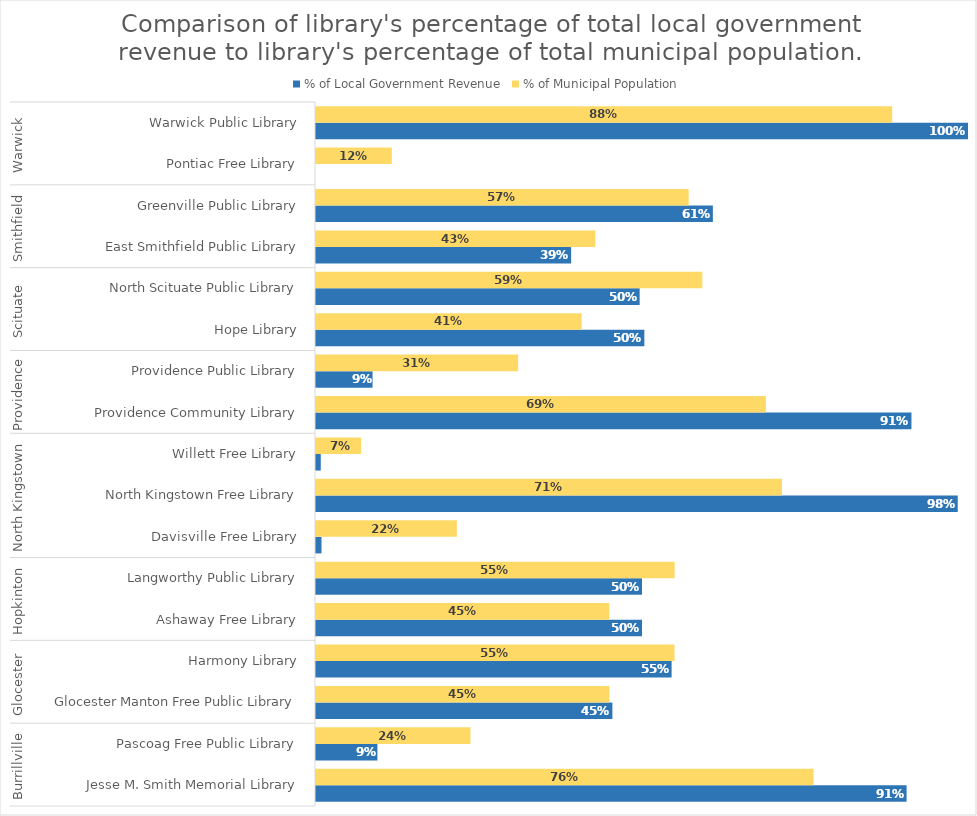
| Category | % of Local Government Revenue | % of Municipal Population |
|---|---|---|
| 0 | 0.906 | 0.763 |
| 1 | 0.094 | 0.237 |
| 2 | 0.455 | 0.45 |
| 3 | 0.545 | 0.55 |
| 4 | 0.5 | 0.45 |
| 5 | 0.5 | 0.55 |
| 6 | 0.008 | 0.216 |
| 7 | 0.984 | 0.715 |
| 8 | 0.007 | 0.069 |
| 9 | 0.913 | 0.69 |
| 10 | 0.087 | 0.31 |
| 11 | 0.504 | 0.407 |
| 12 | 0.496 | 0.593 |
| 13 | 0.391 | 0.428 |
| 14 | 0.609 | 0.572 |
| 15 | 0 | 0.116 |
| 16 | 1 | 0.884 |